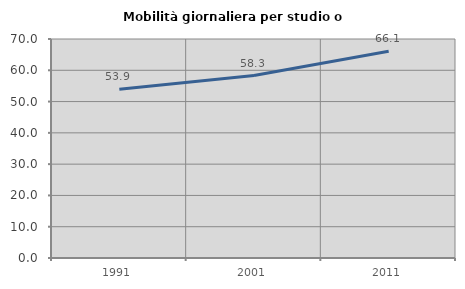
| Category | Mobilità giornaliera per studio o lavoro |
|---|---|
| 1991.0 | 53.941 |
| 2001.0 | 58.333 |
| 2011.0 | 66.059 |